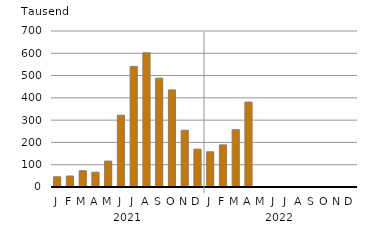
| Category | Insgesamt |
|---|---|
| J | 45880 |
| F | 49447 |
| M | 73215 |
| A | 66318 |
| M | 116309 |
| J | 322019 |
| J | 541067 |
| A | 602187 |
| S | 488445 |
| O | 435715 |
| N | 254659 |
| D | 170087 |
| J | 158157 |
| F | 189087 |
| M | 257235 |
| A | 381138 |
| M | 0 |
| J | 0 |
| J | 0 |
| A | 0 |
| S | 0 |
| O | 0 |
| N | 0 |
| D | 0 |